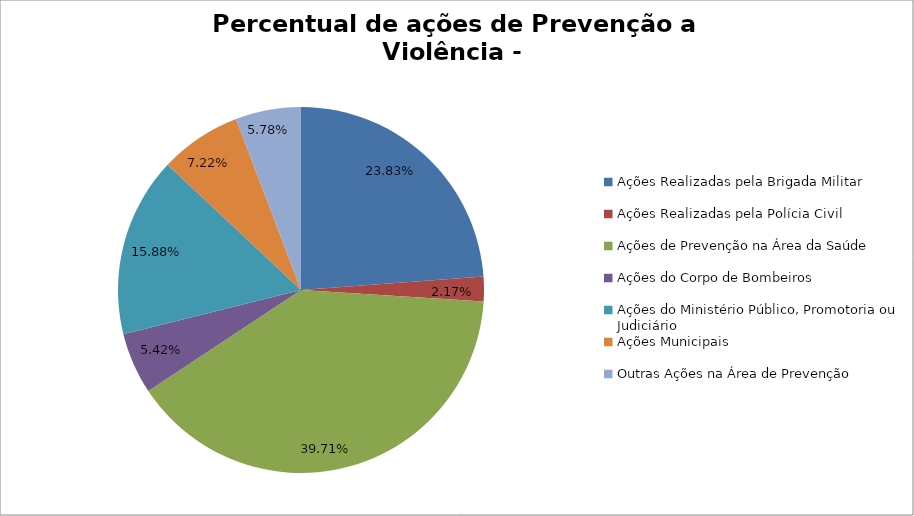
| Category | Percentual |
|---|---|
| Ações Realizadas pela Brigada Militar | 0.238 |
| Ações Realizadas pela Polícia Civil | 0.022 |
| Ações de Prevenção na Área da Saúde | 0.397 |
| Ações do Corpo de Bombeiros | 0.054 |
| Ações do Ministério Público, Promotoria ou Judiciário | 0.159 |
| Ações Municipais | 0.072 |
| Outras Ações na Área de Prevenção | 0.058 |